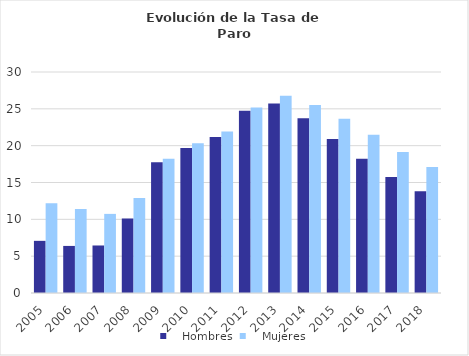
| Category |    Hombres |    Mujeres |
|---|---|---|
| 2005.0 | 7.08 | 12.2 |
| 2006.0 | 6.39 | 11.39 |
| 2007.0 | 6.45 | 10.74 |
| 2008.0 | 10.12 | 12.89 |
| 2009.0 | 17.75 | 18.22 |
| 2010.0 | 19.68 | 20.34 |
| 2011.0 | 21.17 | 21.94 |
| 2012.0 | 24.73 | 25.17 |
| 2013.0 | 25.73 | 26.79 |
| 2014.0 | 23.73 | 25.53 |
| 2015.0 | 20.89 | 23.67 |
| 2016.0 | 18.23 | 21.49 |
| 2017.0 | 15.76 | 19.13 |
| 2018.0 | 13.81 | 17.12 |